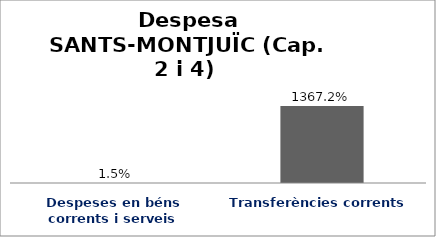
| Category | Series 0 |
|---|---|
| Despeses en béns corrents i serveis | 0.015 |
| Transferències corrents | 13.672 |